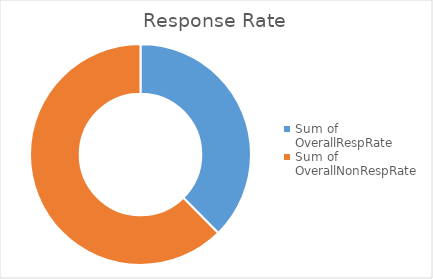
| Category | Total |
|---|---|
| Sum of OverallRespRate | 37.579 |
| Sum of OverallNonRespRate | 62.421 |